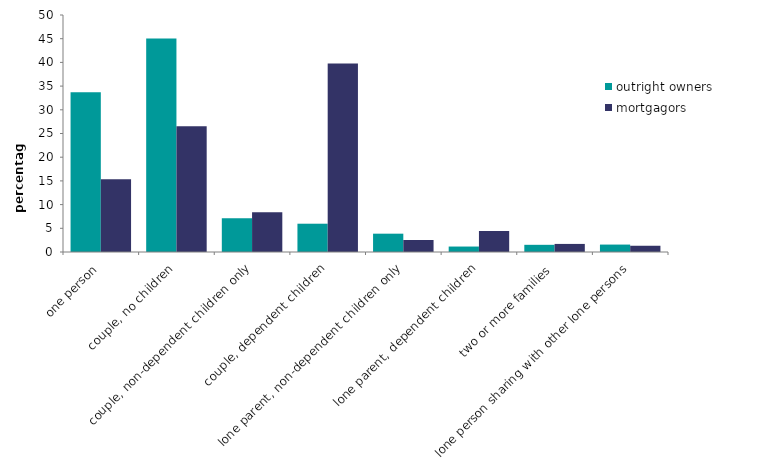
| Category | outright owners | mortgagors |
|---|---|---|
| one person | 33.727 | 15.363 |
| couple, no children | 45.068 | 26.52 |
| couple, non-dependent children only | 7.139 | 8.381 |
| couple, dependent children | 5.968 | 39.743 |
| lone parent, non-dependent children only | 3.865 | 2.537 |
| lone parent, dependent children | 1.151 | 4.434 |
| two or more families | 1.515 | 1.705 |
| lone person sharing with other lone persons | 1.566 | 1.317 |